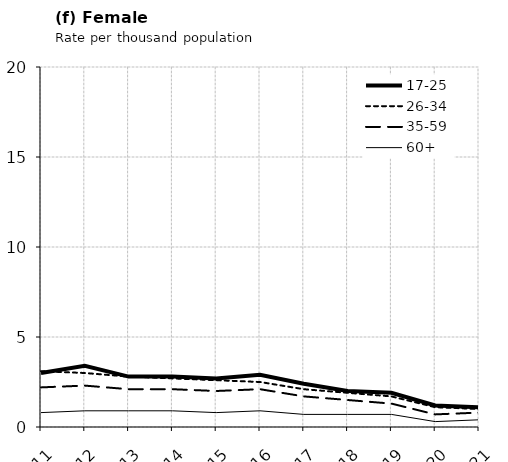
| Category | 17-25 | 26-34 | 35-59 | 60+ |
|---|---|---|---|---|
| 2011.0 | 3 | 3.1 | 2.2 | 0.8 |
| 2012.0 | 3.4 | 3 | 2.3 | 0.9 |
| 2013.0 | 2.8 | 2.8 | 2.1 | 0.9 |
| 2014.0 | 2.8 | 2.7 | 2.1 | 0.9 |
| 2015.0 | 2.7 | 2.6 | 2 | 0.8 |
| 2016.0 | 2.9 | 2.5 | 2.1 | 0.9 |
| 2017.0 | 2.4 | 2.1 | 1.7 | 0.7 |
| 2018.0 | 2 | 1.9 | 1.5 | 0.7 |
| 2019.0 | 1.9 | 1.7 | 1.3 | 0.7 |
| 2020.0 | 1.2 | 1.1 | 0.7 | 0.3 |
| 2021.0 | 1.1 | 1 | 0.8 | 0.4 |